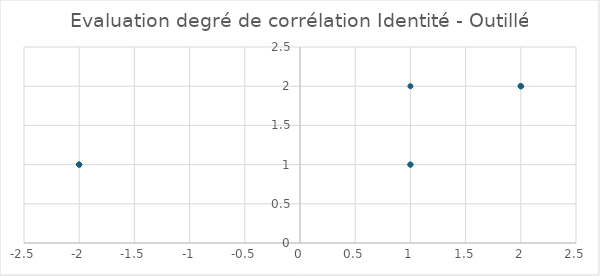
| Category | Series 0 |
|---|---|
| 2.0 | 2 |
| 1.0 | 1 |
| 2.0 | 2 |
| 1.0 | 1 |
| 2.0 | 2 |
| -2.0 | 1 |
| -2.0 | 1 |
| -2.0 | 1 |
| 1.0 | 2 |
| 2.0 | 2 |